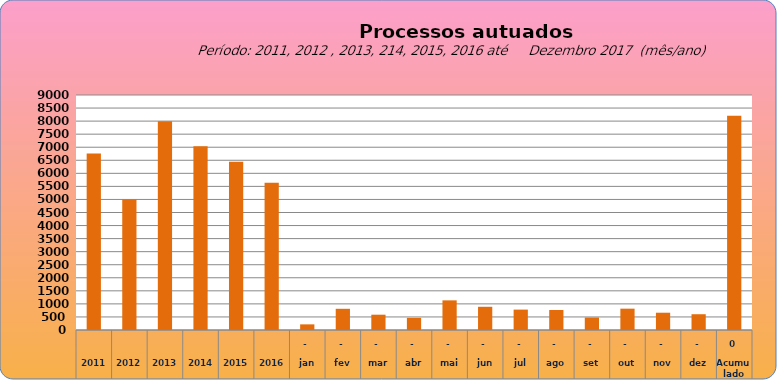
| Category | 6755 |
|---|---|
| 2011 | 6755 |
| 2012 | 4997 |
| 2013 | 7990 |
| 2014 | 7034 |
| 2015 | 6446 |
| 2016 | 5644 |
| jan | 216 |
| fev | 812 |
| mar | 586 |
| abr | 465 |
| mai | 1135 |
| jun | 889 |
| jul | 781 |
| ago | 765 |
| set | 478 |
| out | 817 |
| nov | 662 |
| dez | 604 |
| Acumulado
 | 8210 |